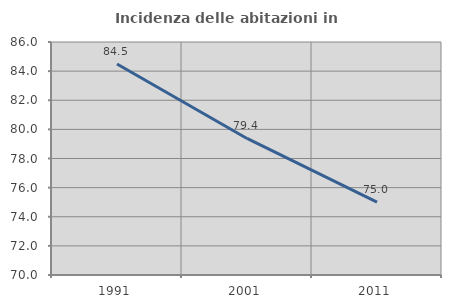
| Category | Incidenza delle abitazioni in proprietà  |
|---|---|
| 1991.0 | 84.49 |
| 2001.0 | 79.377 |
| 2011.0 | 75 |